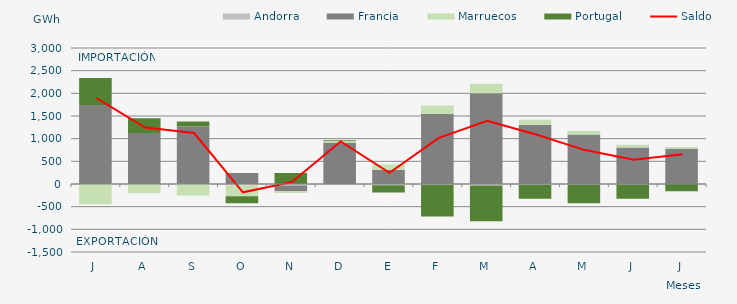
| Category | Andorra | Francia | Marruecos | Portugal |
|---|---|---|---|---|
| J | -0.226 | 1742.725 | -445.987 | 597.215 |
| A | -4.615 | 1125.357 | -201.623 | 324.903 |
| S | -3.339 | 1270.11 | -251.758 | 109.449 |
| O | -26.446 | 240.099 | -243.372 | -152.75 |
| N | -30.553 | -129.248 | -36.387 | 240.868 |
| D | -24.685 | 915.885 | 32.032 | 15.954 |
| E | -26.717 | 310.511 | 121.876 | -159.316 |
| F | -15.973 | 1550.723 | 179.304 | -702.278 |
| M | -32.372 | 2000.98 | 212.165 | -788.594 |
| A | -13.98 | 1308.271 | 106.522 | -309.693 |
| M | -12.717 | 1093.205 | 77.107 | -409.795 |
| J | -8.299 | 804.225 | 59.96 | -319.011 |
| J | -1.488 | 777.149 | 40.929 | -159.488 |